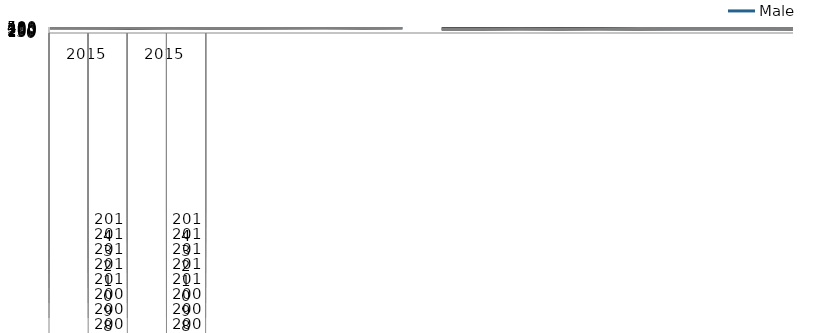
| Category | Male |
|---|---|
| 0 | 426.7 |
| 1 | 414.5 |
| 2 | 374.7 |
| 3 | 422.8 |
| 4 | 399.5 |
| 5 | 393.7 |
| 6 | 407.8 |
| 7 | 430 |
| 8 | 387.2 |
| 9 | 412.4 |
| 10 | 369.4 |
| 11 | 378.8 |
| 12 | 375.4 |
| 13 | 386.6 |
| 14 | 374.9 |
| 15 | 363.6 |
| 16 | 361.8 |
| 17 | 354.4 |
| 18 | 361.7 |
| 19 | 347.9 |